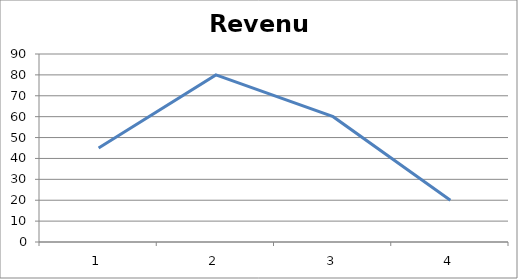
| Category | Revenue |
|---|---|
| 0 | 45 |
| 1 | 80 |
| 2 | 60 |
| 3 | 20 |